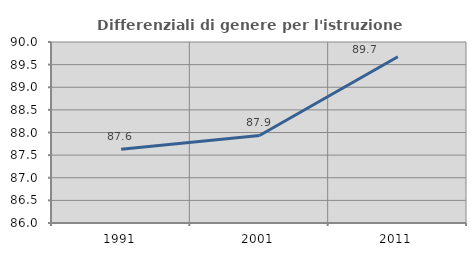
| Category | Differenziali di genere per l'istruzione superiore |
|---|---|
| 1991.0 | 87.629 |
| 2001.0 | 87.934 |
| 2011.0 | 89.674 |